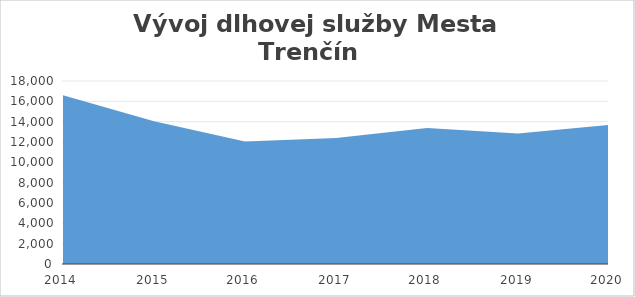
| Category | Series 0 |
|---|---|
| 2014.0 | 16598 |
| 2015.0 | 14037 |
| 2016.0 | 12053 |
| 2017.0 | 12394 |
| 2018.0 | 13381 |
| 2019.0 | 12837 |
| 2020.0 | 13686 |